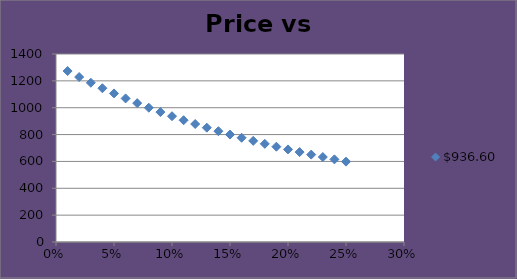
| Category | $936.60  |
|---|---|
| 0.01 | 1273.138 |
| 0.02 | 1228.464 |
| 0.03 | 1185.855 |
| 0.04 | 1145.196 |
| 0.05 | 1106.379 |
| 0.06 | 1069.302 |
| 0.07 | 1033.872 |
| 0.08 | 1000 |
| 0.09 | 967.603 |
| 0.1 | 936.603 |
| 0.11 | 906.927 |
| 0.12 | 878.506 |
| 0.13 | 851.276 |
| 0.14 | 825.177 |
| 0.15 | 800.152 |
| 0.16 | 776.146 |
| 0.17 | 753.109 |
| 0.18 | 730.994 |
| 0.19 | 709.756 |
| 0.2 | 689.352 |
| 0.21 | 669.743 |
| 0.22 | 650.89 |
| 0.23 | 632.759 |
| 0.24 | 615.316 |
| 0.25 | 598.528 |